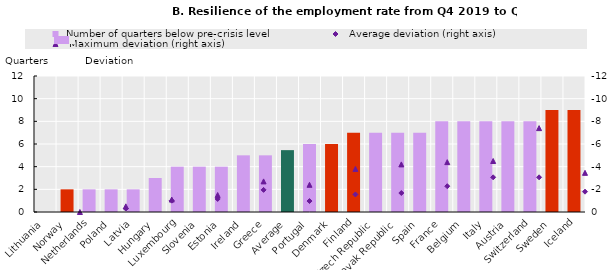
| Category |  Number of quarters below pre-crisis level |
|---|---|
| Lithuania | 0 |
| Norway | 2 |
| Netherlands | 2 |
| Poland | 2 |
| Latvia | 2 |
| Hungary | 3 |
| Luxembourg | 4 |
| Slovenia | 4 |
| Estonia | 4 |
| Ireland | 5 |
| Greece | 5 |
| Average | 5.458 |
| Portugal | 6 |
| Denmark | 6 |
| Finland | 7 |
| Czech Republic | 7 |
| Slovak Republic | 7 |
| Spain | 7 |
| France | 8 |
| Belgium | 8 |
| Italy | 8 |
| Austria | 8 |
| Switzerland | 8 |
| Sweden | 9 |
| Iceland | 9 |